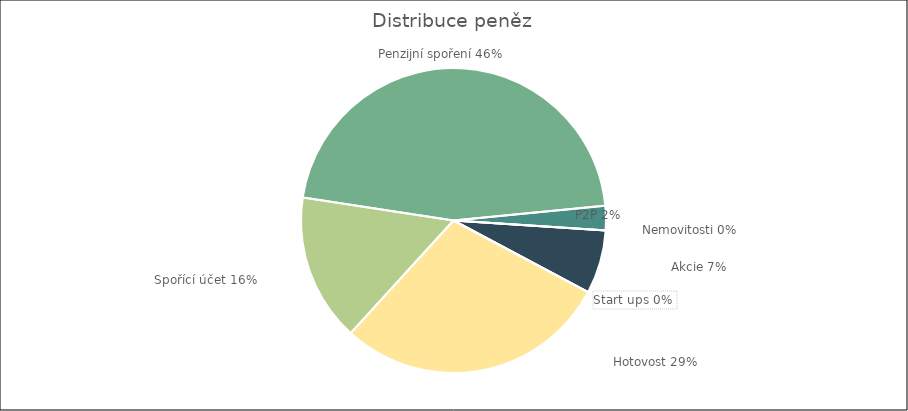
| Category | Series 0 |
|---|---|
| Hotovost | 1291.477 |
| Spořící účet | 696.056 |
| Penzijní spoření | 2049.497 |
| P2P | 115.468 |
| Nemovitosti | 0 |
| Akcie | 300 |
| Start ups | 0 |